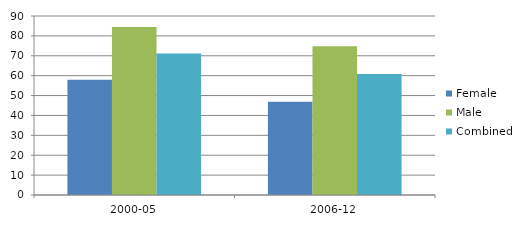
| Category | Female | Male | Combined |
|---|---|---|---|
| 2000-05 | 57.9 | 84.5 | 71.2 |
| 2006-12 | 46.9 | 74.8 | 60.9 |